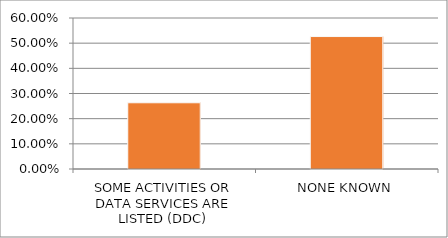
| Category | Series 0 |
|---|---|
| SOME ACTIVITIES OR DATA SERVICES ARE LISTED (DDC) | 0.263 |
| NONE KNOWN | 0.526 |